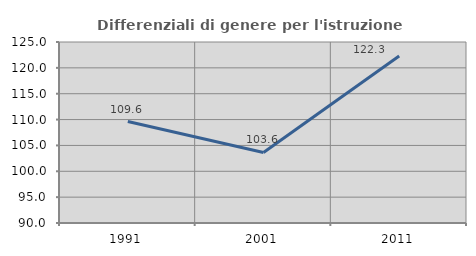
| Category | Differenziali di genere per l'istruzione superiore |
|---|---|
| 1991.0 | 109.611 |
| 2001.0 | 103.634 |
| 2011.0 | 122.291 |